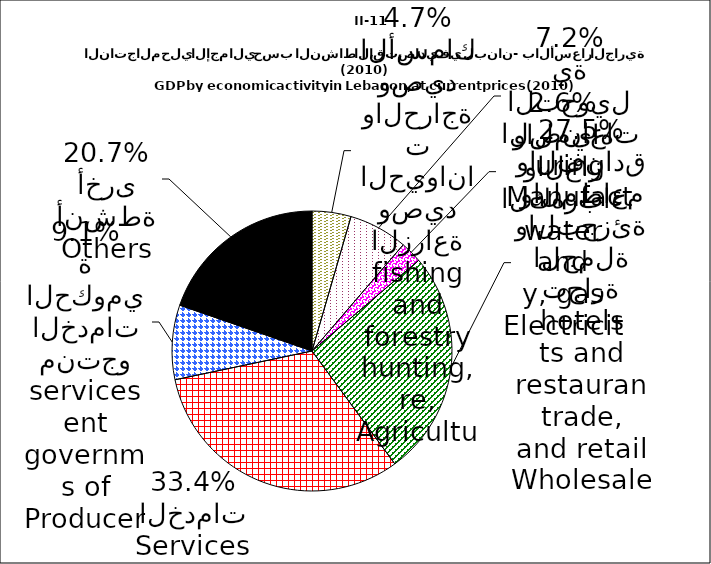
| Category | Series 0 |
|---|---|
| Agriculture, hunting, forestry and fishing | 2650000 |
| Manufacturing | 4002000 |
| Electricity, gas and water | -1473000 |
| Wholesale and retail trade, restaurants and hotels | 15396000 |
| Financial institutions, insurance, real estate and business services | 18720000 |
| Producers of government services | 5071000 |
| Others | 11599000 |